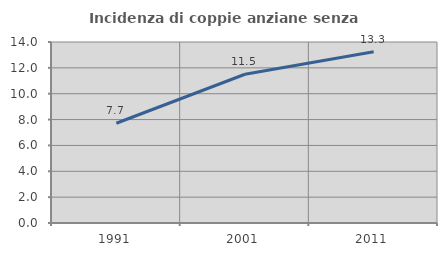
| Category | Incidenza di coppie anziane senza figli  |
|---|---|
| 1991.0 | 7.716 |
| 2001.0 | 11.506 |
| 2011.0 | 13.25 |